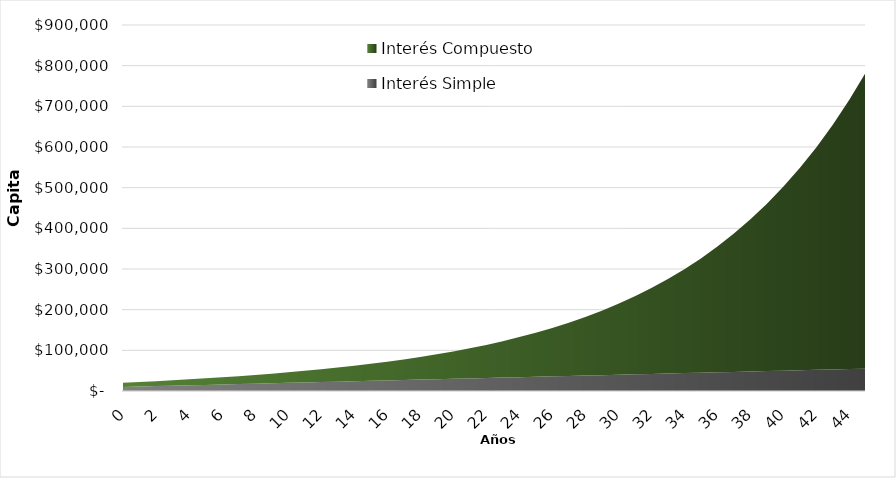
| Category | Interés Simple | Interés Compuesto |
|---|---|---|
| 0.0 | 10000 | 10000 |
| 1.0 | 11000 | 11000 |
| 2.0 | 12000 | 12100 |
| 3.0 | 13000 | 13310 |
| 4.0 | 14000 | 14641 |
| 5.0 | 15000 | 16105.1 |
| 6.0 | 16000 | 17715.61 |
| 7.0 | 17000 | 19487.171 |
| 8.0 | 18000 | 21435.888 |
| 9.0 | 19000 | 23579.477 |
| 10.0 | 20000 | 25937.425 |
| 11.0 | 21000 | 28531.167 |
| 12.0 | 22000 | 31384.284 |
| 13.0 | 23000 | 34522.712 |
| 14.0 | 24000 | 37974.983 |
| 15.0 | 25000 | 41772.482 |
| 16.0 | 26000 | 45949.73 |
| 17.0 | 27000 | 50544.703 |
| 18.0 | 28000 | 55599.173 |
| 19.0 | 29000 | 61159.09 |
| 20.0 | 30000 | 67274.999 |
| 21.0 | 31000 | 74002.499 |
| 22.0 | 32000 | 81402.749 |
| 23.0 | 33000 | 89543.024 |
| 24.0 | 34000 | 98497.327 |
| 25.0 | 35000 | 108347.059 |
| 26.0 | 36000 | 119181.765 |
| 27.0 | 37000 | 131099.942 |
| 28.0 | 38000 | 144209.936 |
| 29.0 | 39000 | 158630.93 |
| 30.0 | 40000 | 174494.023 |
| 31.0 | 41000 | 191943.425 |
| 32.0 | 42000 | 211137.767 |
| 33.0 | 43000 | 232251.544 |
| 34.0 | 44000 | 255476.699 |
| 35.0 | 45000 | 281024.368 |
| 36.0 | 46000 | 309126.805 |
| 37.0 | 47000 | 340039.486 |
| 38.0 | 48000 | 374043.434 |
| 39.0 | 49000 | 411447.778 |
| 40.0 | 50000 | 452592.556 |
| 41.0 | 51000 | 497851.811 |
| 42.0 | 52000 | 547636.992 |
| 43.0 | 53000 | 602400.692 |
| 44.0 | 54000 | 662640.761 |
| 45.0 | 55000 | 728904.837 |